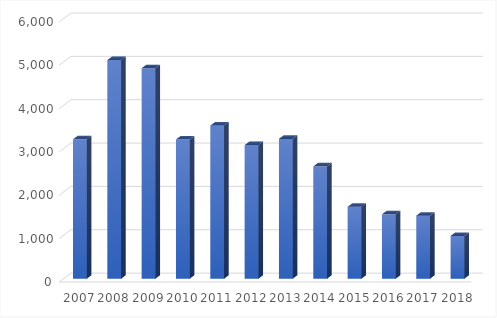
| Category | Deuda del grupo Prisa |
|---|---|
| 2007.0 | 3216.51 |
| 2008.0 | 5044 |
| 2009.0 | 4857 |
| 2010.0 | 3213 |
| 2011.0 | 3533 |
| 2012.0 | 3083 |
| 2013.0 | 3227 |
| 2014.0 | 2592 |
| 2015.0 | 1660 |
| 2016.0 | 1486 |
| 2017.0 | 1455 |
| 2018.0 | 988 |